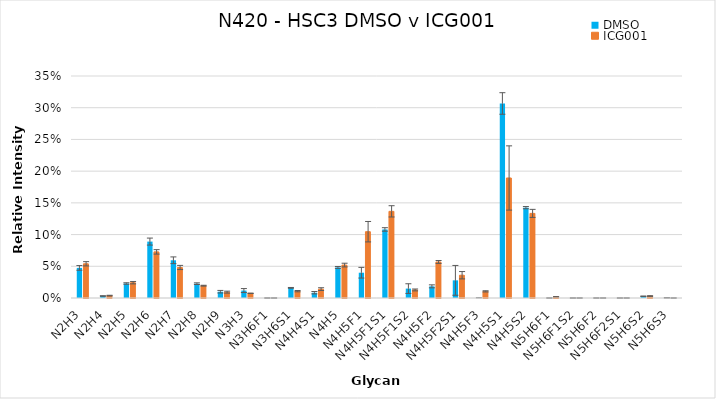
| Category | DMSO | ICG001 |
|---|---|---|
| N2H3 | 0.047 | 0.054 |
| N2H4 | 0.003 | 0.004 |
| N2H5 | 0.023 | 0.024 |
| N2H6 | 0.089 | 0.073 |
| N2H7 | 0.059 | 0.048 |
| N2H8 | 0.023 | 0.019 |
| N2H9 | 0.01 | 0.009 |
| N3H3 | 0.012 | 0.007 |
| N3H6F1 | 0 | 0 |
| N3H6S1 | 0.016 | 0.011 |
| N4H4S1 | 0.008 | 0.014 |
| N4H5 | 0.048 | 0.052 |
| N4H5F1 | 0.04 | 0.105 |
| N4H5F1S1 | 0.108 | 0.137 |
| N4H5F1S2 | 0.015 | 0.013 |
| N4H5F2 | 0.018 | 0.057 |
| N4H5F2S1 | 0.028 | 0.036 |
| N4H5F3 | 0 | 0.01 |
| N4H5S1 | 0.307 | 0.189 |
| N4H5S2 | 0.142 | 0.133 |
| N5H6F1 | 0 | 0.002 |
| N5H6F1S2 | 0 | 0 |
| N5H6F2 | 0 | 0 |
| N5H6F2S1 | 0 | 0 |
| N5H6S2 | 0.003 | 0.003 |
| N5H6S3 | 0 | 0 |